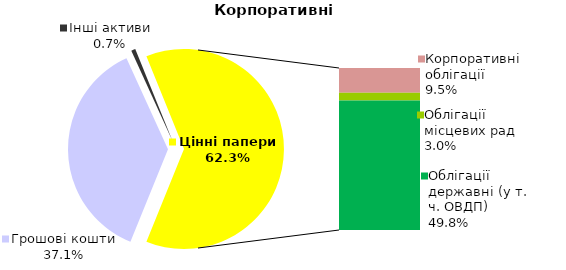
| Category | Корпоративні |
|---|---|
| Грошові кошти | 133.39 |
| Банківські метали | 0 |
| Нерухомість | 0 |
| Інші активи | 2.456 |
| Акції | 0 |
| Корпоративні облігації | 34.275 |
| Облігації місцевих рад | 10.666 |
| Облігації державні (у т. ч. ОВДП) | 179.225 |